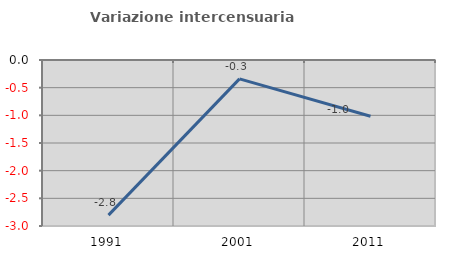
| Category | Variazione intercensuaria annua |
|---|---|
| 1991.0 | -2.803 |
| 2001.0 | -0.341 |
| 2011.0 | -1.018 |